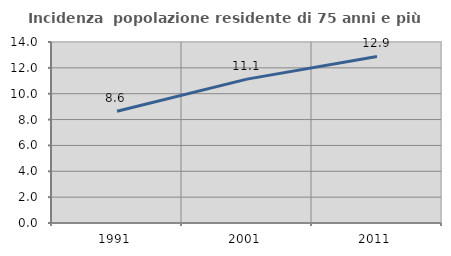
| Category | Incidenza  popolazione residente di 75 anni e più |
|---|---|
| 1991.0 | 8.645 |
| 2001.0 | 11.127 |
| 2011.0 | 12.881 |